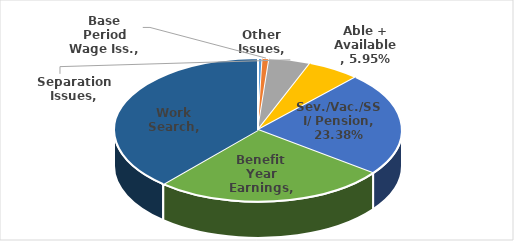
| Category | Series 0 |
|---|---|
| Other Issues | 0.005 |
| Base Period Wage Iss. | 0.008 |
| Separation Issues | 0.047 |
| Able + Available | 0.06 |
| Sev./Vac./SSI/ Pension | 0.234 |
| Benefit Year Earnings | 0.262 |
| Work Search | 0.386 |